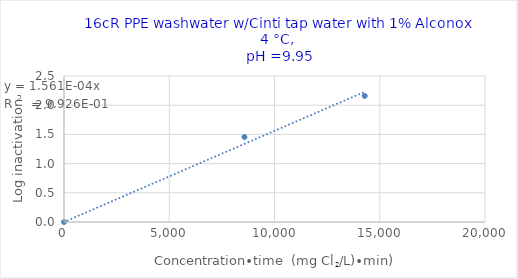
| Category | Series 0 |
|---|---|
| 0.0 | 0 |
| 8571.428571428572 | 1.455 |
| 14285.714285714286 | 2.159 |